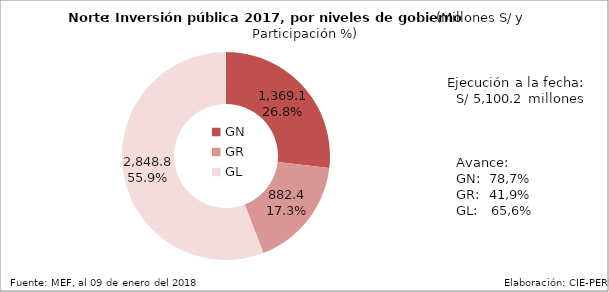
| Category | Ejecutado |
|---|---|
| GN | 1369.126 |
| GR | 882.355 |
| GL | 2848.768 |